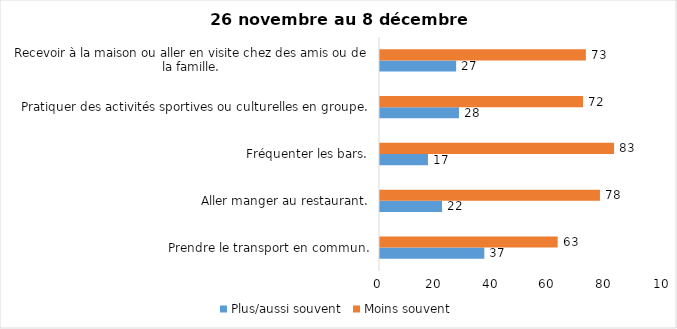
| Category | Plus/aussi souvent | Moins souvent |
|---|---|---|
| Prendre le transport en commun. | 37 | 63 |
| Aller manger au restaurant. | 22 | 78 |
| Fréquenter les bars. | 17 | 83 |
| Pratiquer des activités sportives ou culturelles en groupe. | 28 | 72 |
| Recevoir à la maison ou aller en visite chez des amis ou de la famille. | 27 | 73 |